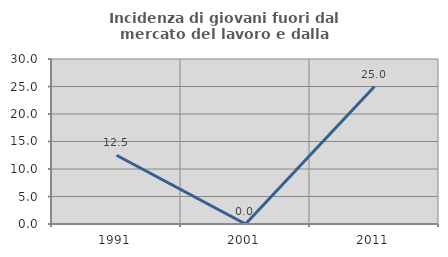
| Category | Incidenza di giovani fuori dal mercato del lavoro e dalla formazione  |
|---|---|
| 1991.0 | 12.5 |
| 2001.0 | 0 |
| 2011.0 | 25 |